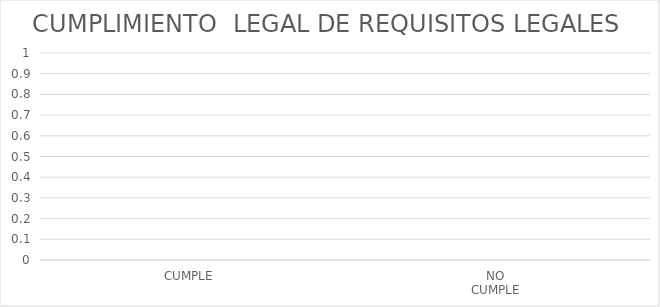
| Category | Series 0 |
|---|---|
| CUMPLE  | 0 |
| NO 
CUMPLE  | 0 |